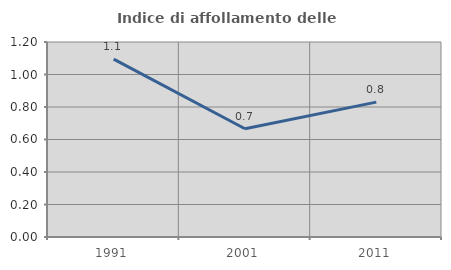
| Category | Indice di affollamento delle abitazioni  |
|---|---|
| 1991.0 | 1.095 |
| 2001.0 | 0.666 |
| 2011.0 | 0.83 |